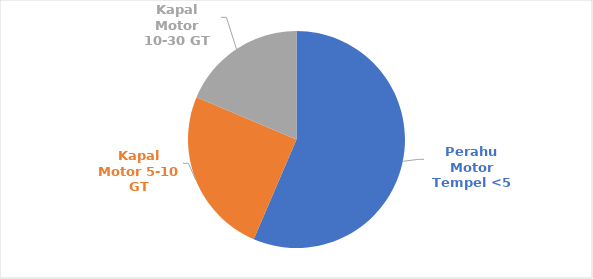
| Category | gabungan |
|---|---|
| Perahu Motor Tempel <5 | 805 |
| Kapal Motor 5-10 GT | 355 |
| Kapal Motor 10-30 GT | 266 |